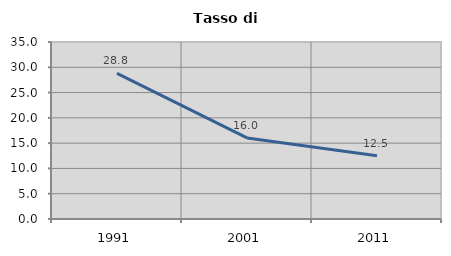
| Category | Tasso di disoccupazione   |
|---|---|
| 1991.0 | 28.786 |
| 2001.0 | 16.024 |
| 2011.0 | 12.486 |